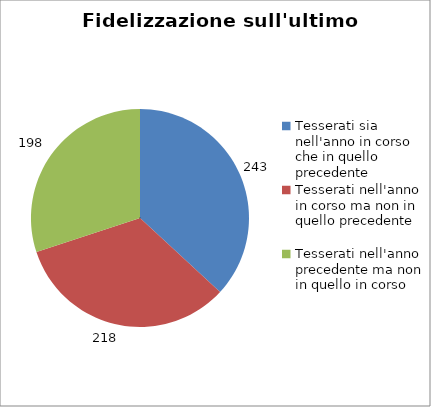
| Category | Nr. Tesserati |
|---|---|
| Tesserati sia nell'anno in corso che in quello precedente | 243 |
| Tesserati nell'anno in corso ma non in quello precedente | 218 |
| Tesserati nell'anno precedente ma non in quello in corso | 198 |